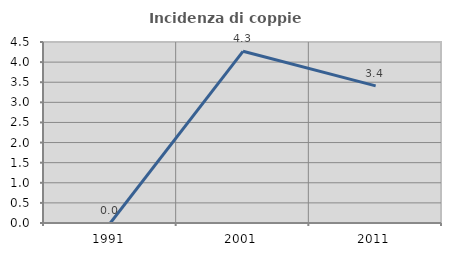
| Category | Incidenza di coppie miste |
|---|---|
| 1991.0 | 0 |
| 2001.0 | 4.268 |
| 2011.0 | 3.409 |